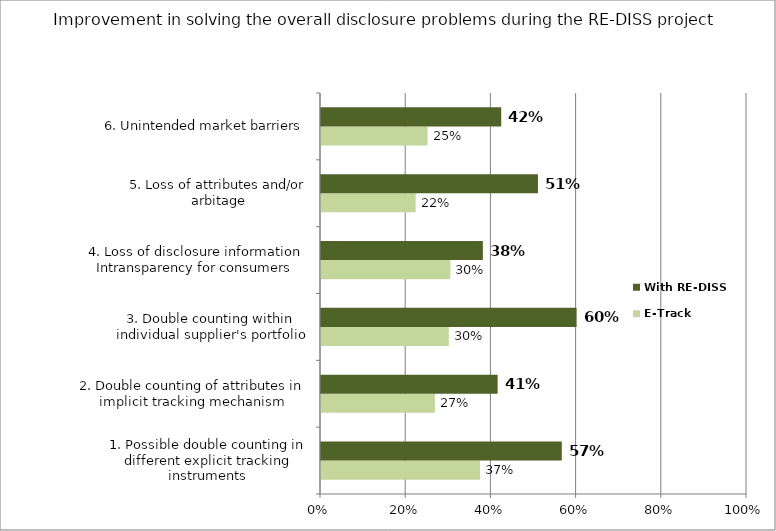
| Category | E-Track | With RE-DISS |
|---|---|---|
| 1. Possible double counting in different explicit tracking instruments | 0.373 | 0.565 |
| 2. Double counting of attributes in implicit tracking mechanism | 0.267 | 0.415 |
| 3. Double counting within individual supplier's portfolio | 0.3 | 0.6 |
| 4. Loss of disclosure information
Intransparency for consumers | 0.304 | 0.38 |
| 5. Loss of attributes and/or arbitage | 0.222 | 0.509 |
| 6. Unintended market barriers | 0.25 | 0.423 |